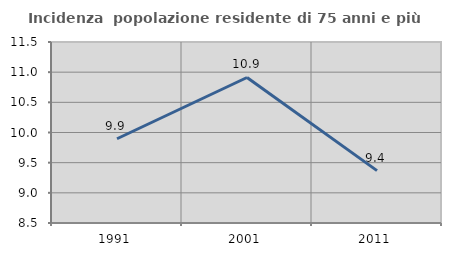
| Category | Incidenza  popolazione residente di 75 anni e più |
|---|---|
| 1991.0 | 9.896 |
| 2001.0 | 10.912 |
| 2011.0 | 9.368 |